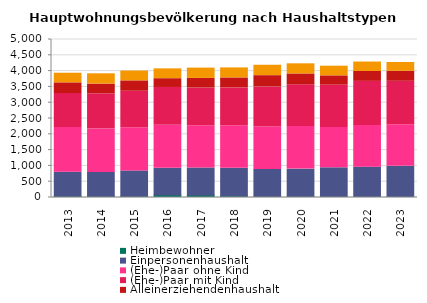
| Category | Heimbewohner | Einpersonenhaushalt | (Ehe-)Paar ohne Kind | (Ehe-)Paar mit Kind | Alleinerziehendenhaushalt | sonstiger Mehrpersonenhaushalt |
|---|---|---|---|---|---|---|
| 2013.0 | 41 | 761 | 1415 | 1073 | 338 | 305 |
| 2014.0 | 38 | 755 | 1376 | 1112 | 308 | 326 |
| 2015.0 | 38 | 803 | 1367 | 1154 | 329 | 311 |
| 2016.0 | 83 | 842 | 1358 | 1199 | 278 | 311 |
| 2017.0 | 77 | 857 | 1340 | 1187 | 308 | 326 |
| 2018.0 | 50 | 875 | 1349 | 1193 | 317 | 317 |
| 2019.0 | 8 | 881 | 1352 | 1259 | 356 | 329 |
| 2020.0 | 5 | 893 | 1346 | 1322 | 344 | 320 |
| 2021.0 | 8 | 932 | 1274 | 1343 | 293 | 305 |
| 2022.0 | 5 | 956 | 1319 | 1394 | 314 | 299 |
| 2023.0 | 5 | 980 | 1316 | 1376 | 317 | 278 |